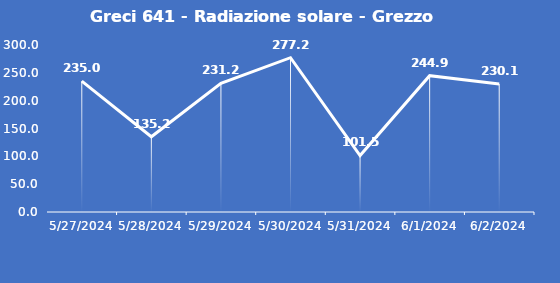
| Category | Greci 641 - Radiazione solare - Grezzo (W/m2) |
|---|---|
| 5/27/24 | 235 |
| 5/28/24 | 135.2 |
| 5/29/24 | 231.2 |
| 5/30/24 | 277.2 |
| 5/31/24 | 101.5 |
| 6/1/24 | 244.9 |
| 6/2/24 | 230.1 |